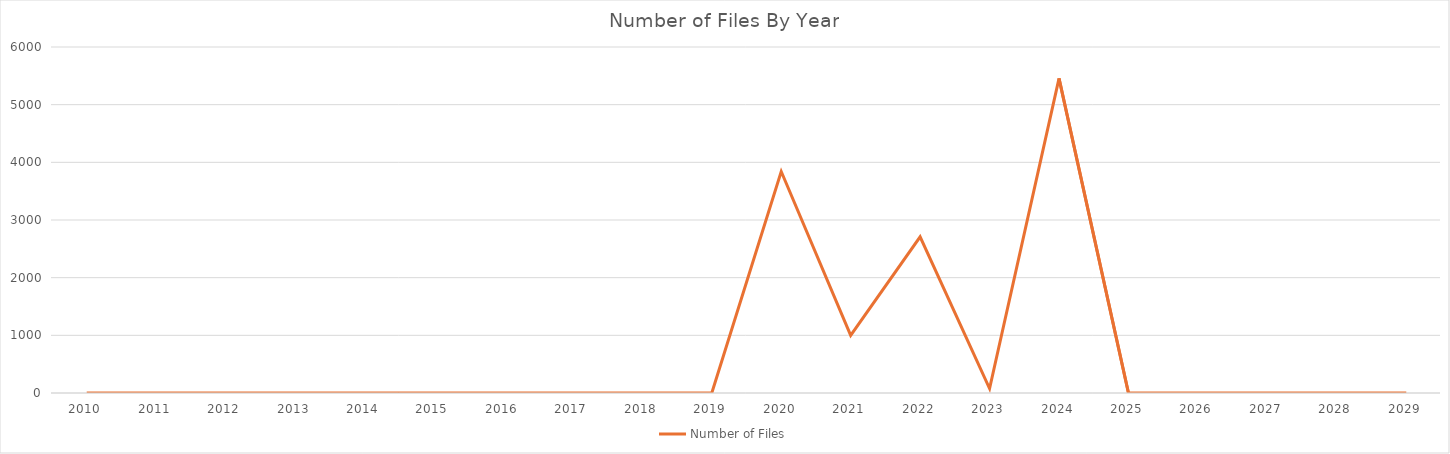
| Category | Number of Files |
|---|---|
| 2010.0 | 0 |
| 2011.0 | 0 |
| 2012.0 | 0 |
| 2013.0 | 0 |
| 2014.0 | 0 |
| 2015.0 | 0 |
| 2016.0 | 0 |
| 2017.0 | 0 |
| 2018.0 | 0 |
| 2019.0 | 0 |
| 2020.0 | 3841 |
| 2021.0 | 998 |
| 2022.0 | 2709 |
| 2023.0 | 78 |
| 2024.0 | 5457 |
| 2025.0 | 0 |
| 2026.0 | 0 |
| 2027.0 | 0 |
| 2028.0 | 0 |
| 2029.0 | 0 |